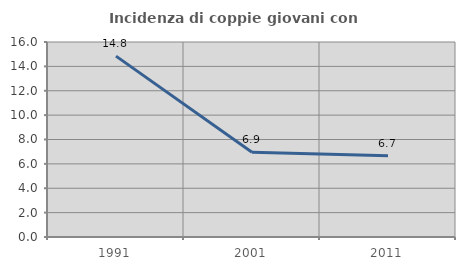
| Category | Incidenza di coppie giovani con figli |
|---|---|
| 1991.0 | 14.841 |
| 2001.0 | 6.946 |
| 2011.0 | 6.676 |